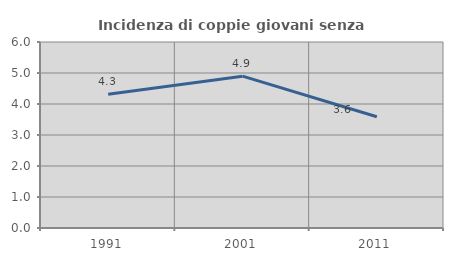
| Category | Incidenza di coppie giovani senza figli |
|---|---|
| 1991.0 | 4.314 |
| 2001.0 | 4.898 |
| 2011.0 | 3.587 |